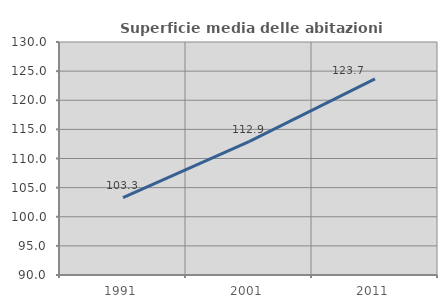
| Category | Superficie media delle abitazioni occupate |
|---|---|
| 1991.0 | 103.27 |
| 2001.0 | 112.9 |
| 2011.0 | 123.657 |